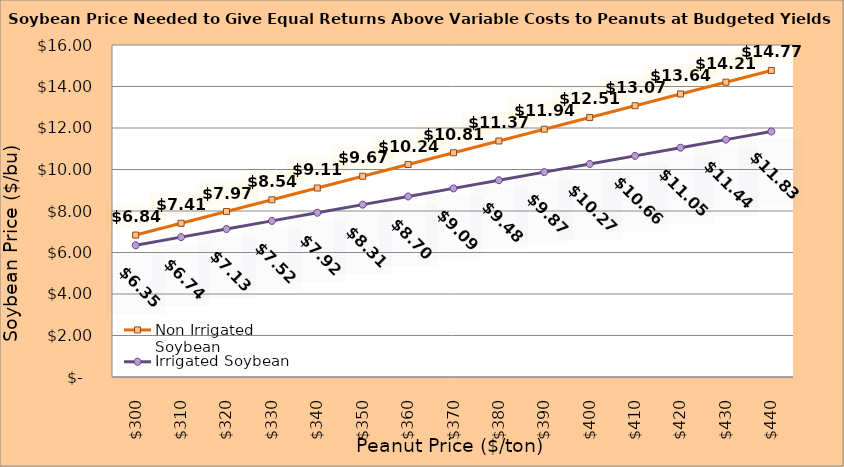
| Category | Non Irrigated Soybean | Irrigated Soybean |
|---|---|---|
| 299.8936170212766 | 6.841 | 6.349 |
| 309.8936170212766 | 7.407 | 6.74 |
| 319.8936170212766 | 7.974 | 7.132 |
| 329.8936170212766 | 8.541 | 7.524 |
| 339.8936170212766 | 9.107 | 7.915 |
| 349.8936170212766 | 9.674 | 8.307 |
| 359.8936170212766 | 10.241 | 8.699 |
| 369.8936170212766 | 10.807 | 9.09 |
| 379.8936170212766 | 11.374 | 9.482 |
| 389.8936170212766 | 11.941 | 9.874 |
| 399.8936170212766 | 12.507 | 10.265 |
| 409.8936170212766 | 13.074 | 10.657 |
| 419.8936170212766 | 13.641 | 11.049 |
| 429.8936170212766 | 14.207 | 11.44 |
| 439.8936170212766 | 14.774 | 11.832 |